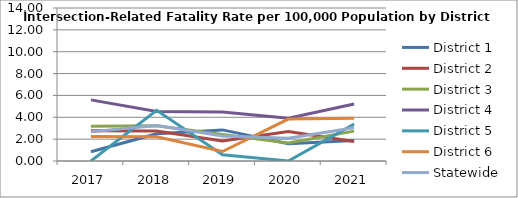
| Category | District 1 | District 2 | District 3 | District 4 | District 5 | District 6 | Statewide |
|---|---|---|---|---|---|---|---|
| 2017.0 | 0.852 | 2.764 | 3.185 | 5.592 | 0 | 2.25 | 2.679 |
| 2018.0 | 2.498 | 2.735 | 3.223 | 4.521 | 4.639 | 2.211 | 3.249 |
| 2019.0 | 2.847 | 1.822 | 2.42 | 4.477 | 0.575 | 0.87 | 2.294 |
| 2020.0 | 1.585 | 2.7 | 1.649 | 3.921 | 0 | 3.837 | 2.08 |
| 2021.0 | 1.884 | 1.779 | 2.733 | 5.214 | 3.37 | 3.908 | 3.051 |